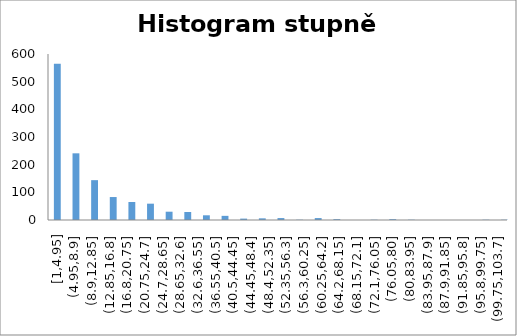
| Category | Series 0 |
|---|---|
| 2.0 | 361 |
| 4.0 | 204 |
| 6.0 | 130 |
| 8.0 | 111 |
| 10.0 | 86 |
| 12.0 | 58 |
| 14.0 | 48 |
| 16.0 | 35 |
| 18.0 | 30 |
| 20.0 | 35 |
| 22.0 | 27 |
| 24.0 | 32 |
| 26.0 | 19 |
| 28.0 | 11 |
| 30.0 | 12 |
| 32.0 | 17 |
| 34.0 | 10 |
| 36.0 | 7 |
| 38.0 | 8 |
| 40.0 | 7 |
| 42.0 | 1 |
| 44.0 | 4 |
| 46.0 | 2 |
| 48.0 | 4 |
| 50.0 | 3 |
| 52.0 | 4 |
| 54.0 | 0 |
| 56.0 | 1 |
| 58.0 | 3 |
| 60.0 | 4 |
| 62.0 | 3 |
| 64.0 | 0 |
| 66.0 | 0 |
| 68.0 | 0 |
| 70.0 | 1 |
| 72.0 | 0 |
| 74.0 | 2 |
| 76.0 | 1 |
| 78.0 | 0 |
| 80.0 | 1 |
| 82.0 | 0 |
| 84.0 | 0 |
| 86.0 | 0 |
| 88.0 | 0 |
| 90.0 | 0 |
| 92.0 | 1 |
| 94.0 | 0 |
| 96.0 | 0 |
| 98.0 | 0 |
| 100.0 | 2 |